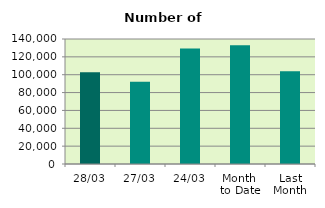
| Category | Series 0 |
|---|---|
| 28/03 | 102838 |
| 27/03 | 91994 |
| 24/03 | 129270 |
| Month 
to Date | 133126.8 |
| Last
Month | 103910.7 |